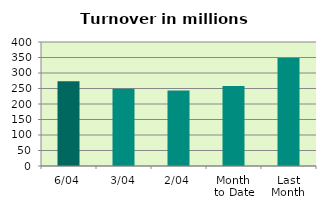
| Category | Series 0 |
|---|---|
| 6/04 | 273.425 |
| 3/04 | 249.557 |
| 2/04 | 243.276 |
| Month 
to Date | 257.668 |
| Last
Month | 348.012 |